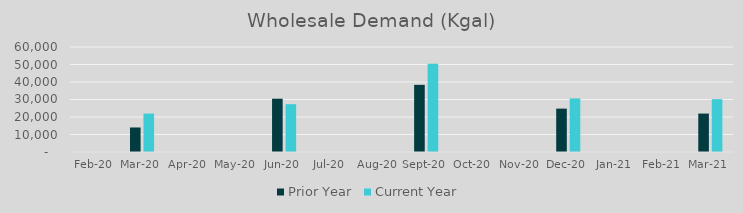
| Category | Prior Year | Current Year |
|---|---|---|
| 2020-02-01 | 0 | 0 |
| 2020-03-01 | 14013.78 | 21965.02 |
| 2020-04-01 | 0 | 0 |
| 2020-05-01 | 0 | 0 |
| 2020-06-01 | 30443.6 | 27331 |
| 2020-07-01 | 0 | 0 |
| 2020-08-01 | 0 | 0 |
| 2020-09-01 | 38376.14 | 50400.24 |
| 2020-10-01 | 0 | 0 |
| 2020-11-01 | 0 | 0 |
| 2020-12-01 | 24784.98 | 30611.9 |
| 2021-01-01 | 0 | 0 |
| 2021-02-01 | 0 | 0 |
| 2021-03-01 | 21965.02 | 30196.76 |